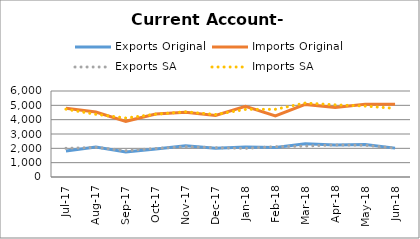
| Category | Exports Original | Imports Original | Exports SA | Imports SA |
|---|---|---|---|---|
| 2017-07-11 | 1817 | 4799 | 2000 | 4732 |
| 2017-08-11 | 2090 | 4530 | 2066 | 4373 |
| 2017-09-11 | 1743 | 3884 | 1838 | 4115 |
| 2017-10-11 | 1960 | 4395 | 1994 | 4381 |
| 2017-11-11 | 2173 | 4515 | 2113 | 4548 |
| 2017-12-11 | 2008 | 4297 | 2046 | 4361 |
| 2018-01-11 | 2090 | 4930 | 1999 | 4719 |
| 2018-02-11 | 2057 | 4260 | 2114 | 4721 |
| 2018-03-11 | 2316 | 5066 | 2159 | 5160 |
| 2018-04-11 | 2235 | 4846 | 2236 | 5034 |
| 2018-05-11 | 2265 | 5075 | 2214 | 4948 |
| 2018-06-11 | 2014 | 5074 | 2017 | 4787 |